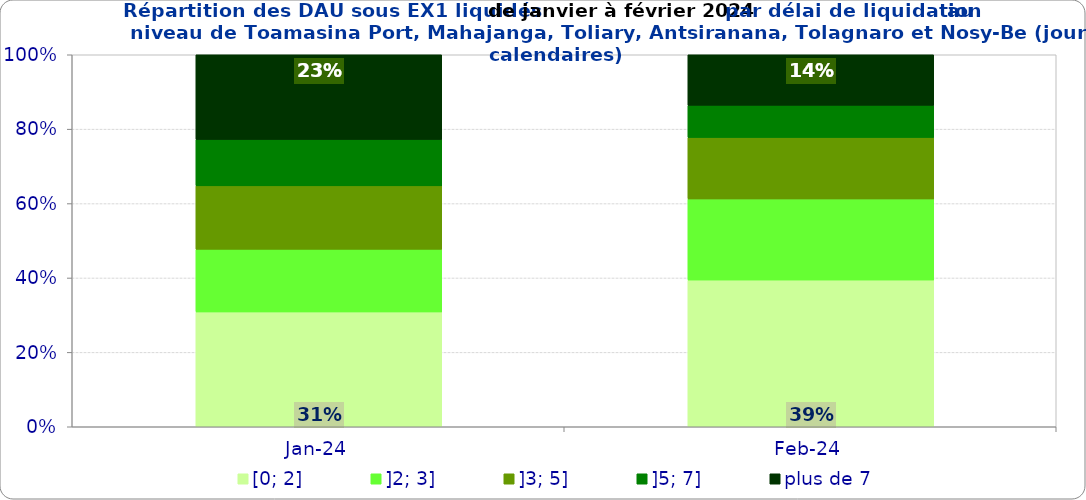
| Category | [0; 2] | ]2; 3] | ]3; 5] | ]5; 7] | plus de 7 |
|---|---|---|---|---|---|
| 2024-01-01 | 0.309 | 0.168 | 0.171 | 0.125 | 0.228 |
| 2024-02-01 | 0.394 | 0.218 | 0.165 | 0.087 | 0.136 |